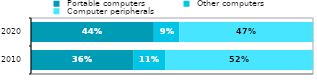
| Category |  Portable computers |  Other computers |  Computer peripherals |
|---|---|---|---|
| 2010.0 | 0.364 | 0.112 | 0.524 |
| 2020.0 | 0.436 | 0.09 | 0.474 |